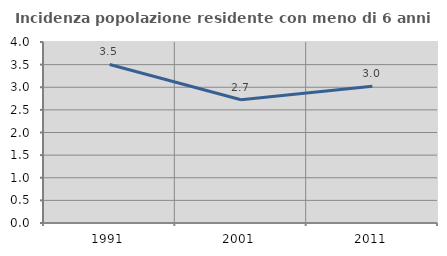
| Category | Incidenza popolazione residente con meno di 6 anni |
|---|---|
| 1991.0 | 3.503 |
| 2001.0 | 2.725 |
| 2011.0 | 3.023 |